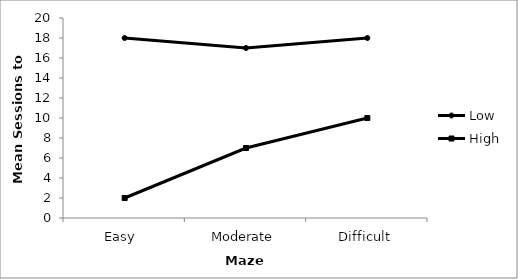
| Category | Low | High |
|---|---|---|
| Easy  | 18 | 2 |
| Moderate | 17 | 7 |
| Difficult | 18 | 10 |